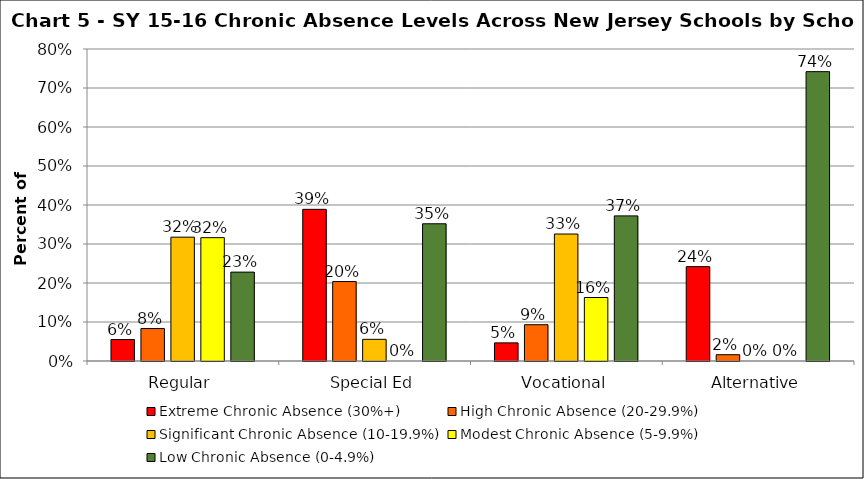
| Category | Extreme Chronic Absence (30%+) | High Chronic Absence (20-29.9%) | Significant Chronic Absence (10-19.9%) | Modest Chronic Absence (5-9.9%) | Low Chronic Absence (0-4.9%) |
|---|---|---|---|---|---|
| 0 | 0.055 | 0.083 | 0.318 | 0.316 | 0.228 |
| 1 | 0.389 | 0.204 | 0.056 | 0 | 0.352 |
| 2 | 0.047 | 0.093 | 0.326 | 0.163 | 0.372 |
| 3 | 0.242 | 0.016 | 0 | 0 | 0.742 |